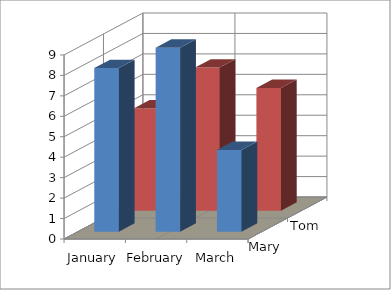
| Category | Mary | Tom |
|---|---|---|
| January | 8 | 5 |
| February | 9 | 7 |
| March | 4 | 6 |